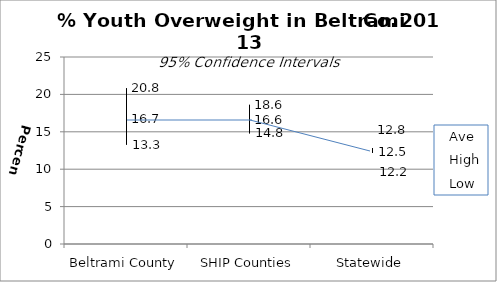
| Category | Ave | High | Low |
|---|---|---|---|
| Beltrami County | 16.7 | 20.8 | 13.3 |
| SHIP Counties | 16.6 | 18.6 | 14.8 |
| Statewide | 12.5 | 12.8 | 12.2 |